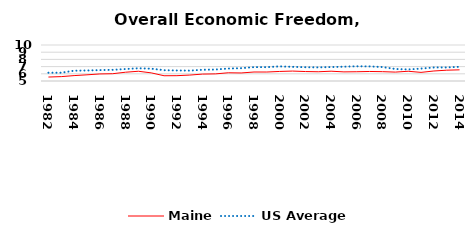
| Category | Maine | US Average |
|---|---|---|
| 1982.0 | 5.549 | 6.149 |
| 1983.0 | 5.608 | 6.152 |
| 1984.0 | 5.751 | 6.429 |
| 1985.0 | 5.859 | 6.464 |
| 1986.0 | 5.98 | 6.512 |
| 1987.0 | 6.013 | 6.552 |
| 1988.0 | 6.219 | 6.659 |
| 1989.0 | 6.352 | 6.767 |
| 1990.0 | 6.13 | 6.71 |
| 1991.0 | 5.73 | 6.502 |
| 1992.0 | 5.74 | 6.463 |
| 1993.0 | 5.823 | 6.446 |
| 1994.0 | 5.96 | 6.563 |
| 1995.0 | 5.988 | 6.593 |
| 1996.0 | 6.142 | 6.73 |
| 1997.0 | 6.116 | 6.781 |
| 1998.0 | 6.25 | 6.926 |
| 1999.0 | 6.248 | 6.925 |
| 2000.0 | 6.326 | 7.031 |
| 2001.0 | 6.378 | 6.969 |
| 2002.0 | 6.314 | 6.912 |
| 2003.0 | 6.284 | 6.892 |
| 2004.0 | 6.359 | 6.934 |
| 2005.0 | 6.267 | 6.99 |
| 2006.0 | 6.287 | 7.048 |
| 2007.0 | 6.322 | 7.028 |
| 2008.0 | 6.297 | 6.935 |
| 2009.0 | 6.236 | 6.668 |
| 2010.0 | 6.354 | 6.605 |
| 2011.0 | 6.198 | 6.72 |
| 2012.0 | 6.391 | 6.883 |
| 2013.0 | 6.501 | 6.881 |
| 2014.0 | 6.55 | 6.973 |